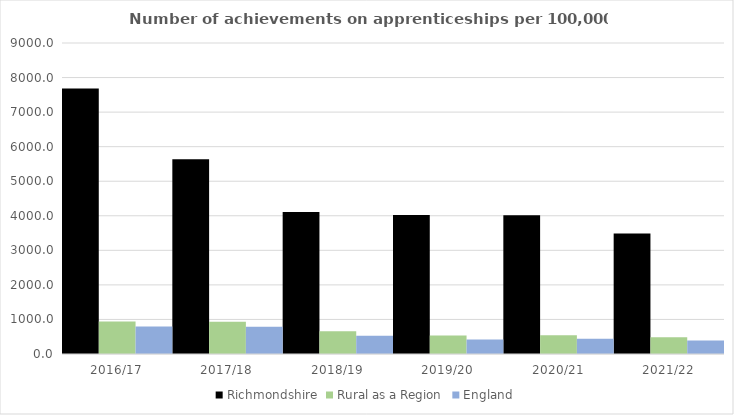
| Category | Richmondshire | Rural as a Region | England |
|---|---|---|---|
| 2016/17 | 7685 | 942.594 | 797 |
| 2017/18 | 5634 | 931.709 | 790 |
| 2018/19 | 4110 | 656.44 | 528 |
| 2019/20 | 4022 | 535.552 | 418 |
| 2020/21 | 4013 | 545.333 | 444 |
| 2021/22 | 3486 | 482.936 | 389 |